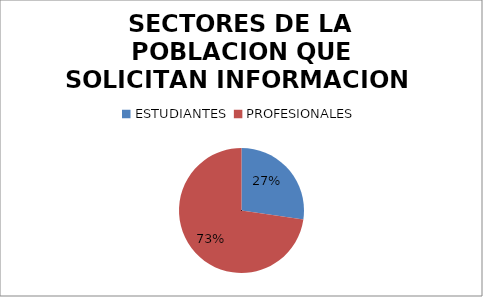
| Category | SECTORES DE LA POBLACION QUE SOLICITAN INFORMACION  |
|---|---|
| ESTUDIANTES  | 9 |
| PROFESIONALES | 24 |